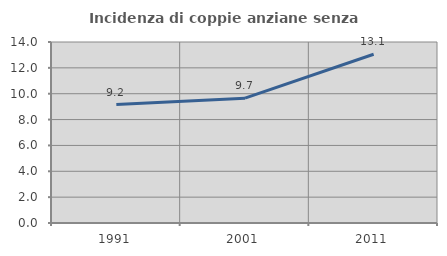
| Category | Incidenza di coppie anziane senza figli  |
|---|---|
| 1991.0 | 9.163 |
| 2001.0 | 9.653 |
| 2011.0 | 13.053 |